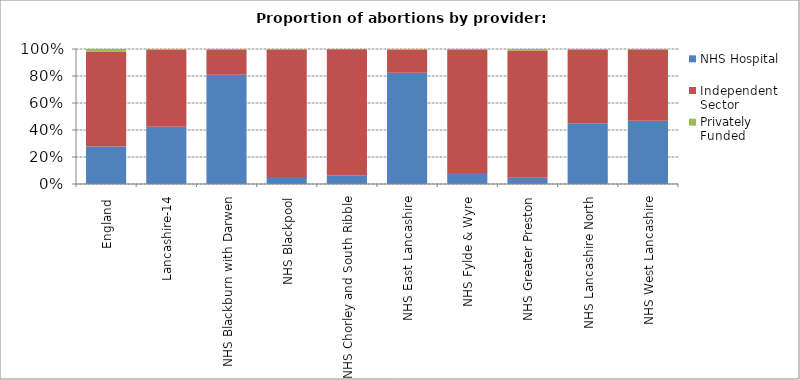
| Category | NHS Hospital | Independent Sector | Privately Funded |
|---|---|---|---|
| England  | 27.738 | 70.428 | 1.833 |
| Lancashire-14 | 42.441 | 56.946 | 0.613 |
| NHS Blackburn with Darwen | 81.006 | 18.25 | 0.745 |
| NHS Blackpool | 5.274 | 94.32 | 0.406 |
| NHS Chorley and South Ribble | 6.472 | 93.319 | 0.209 |
| NHS East Lancashire | 82.494 | 17.041 | 0.465 |
| NHS Fylde & Wyre | 8.101 | 91.139 | 0.759 |
| NHS Greater Preston | 4.579 | 94.387 | 1.034 |
| NHS Lancashire North | 45.038 | 54.198 | 0.763 |
| NHS West Lancashire | 46.823 | 52.508 | 0.669 |